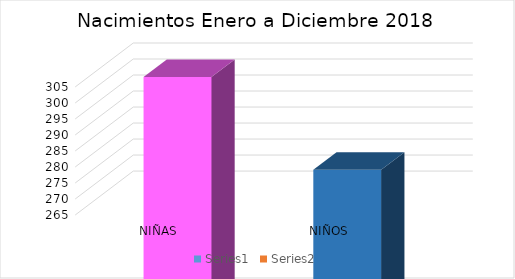
| Category | Series 0 | Series 1 |
|---|---|---|
| NIÑAS |  | 304 |
| NIÑOS |  | 275 |